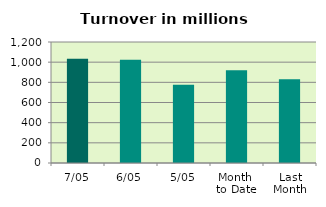
| Category | Series 0 |
|---|---|
| 7/05 | 1033.138 |
| 6/05 | 1023.201 |
| 5/05 | 776.011 |
| Month 
to Date | 919.797 |
| Last
Month | 829.993 |